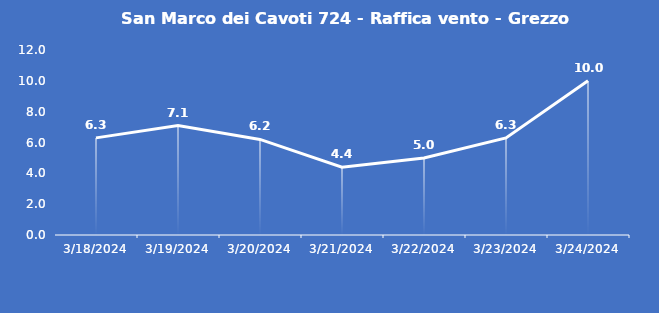
| Category | San Marco dei Cavoti 724 - Raffica vento - Grezzo (m/s) |
|---|---|
| 3/18/24 | 6.3 |
| 3/19/24 | 7.1 |
| 3/20/24 | 6.2 |
| 3/21/24 | 4.4 |
| 3/22/24 | 5 |
| 3/23/24 | 6.3 |
| 3/24/24 | 10 |